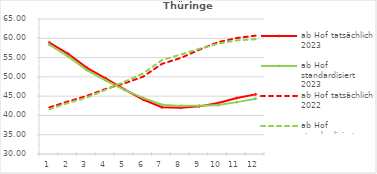
| Category | ab Hof tatsächlich 2023 | ab Hof standardisiert 2023 | ab Hof tatsächlich 2022 | ab Hof standardisiert 2022 |
|---|---|---|---|---|
| 0 | 58.899 | 58.377 | 42.082 | 41.592 |
| 1 | 55.978 | 55.325 | 43.631 | 43.243 |
| 2 | 52.341 | 51.769 | 45.061 | 44.656 |
| 3 | 49.618 | 49.095 | 46.866 | 46.646 |
| 4 | 46.768 | 46.636 | 48.309 | 48.73 |
| 5 | 44.117 | 44.545 | 50.051 | 50.88 |
| 6 | 42.112 | 42.771 | 53.361 | 54.337 |
| 7 | 42.004 | 42.477 | 54.886 | 55.787 |
| 8 | 42.347 | 42.52 | 57.05 | 57.285 |
| 9 | 43.213 | 42.687 | 59.007 | 58.619 |
| 10 | 44.522 | 43.446 | 60.069 | 59.477 |
| 11 | 45.463 | 44.335 | 60.688 | 59.747 |